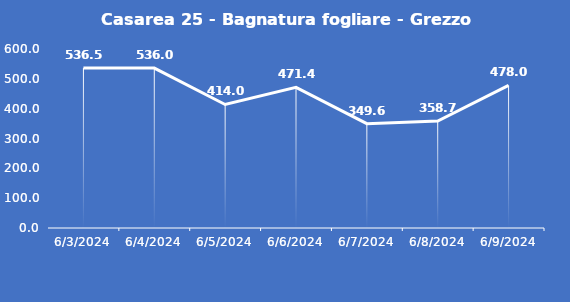
| Category | Casarea 25 - Bagnatura fogliare - Grezzo (min) |
|---|---|
| 6/3/24 | 536.5 |
| 6/4/24 | 536 |
| 6/5/24 | 414 |
| 6/6/24 | 471.4 |
| 6/7/24 | 349.6 |
| 6/8/24 | 358.7 |
| 6/9/24 | 478 |